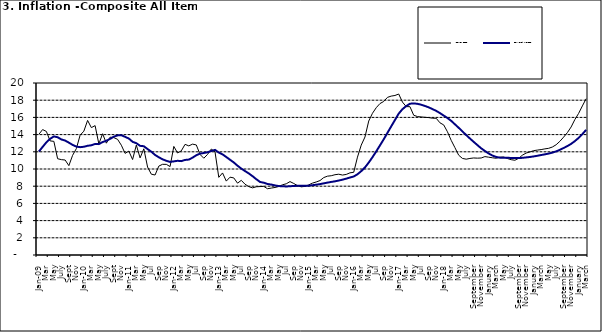
| Category | Year-on Rate | 12-Month Average |
|---|---|---|
| Jan-09 | 14.034 | 12.032 |
| Feb | 14.584 | 12.567 |
| Mar | 14.366 | 13.101 |
| Apr | 13.268 | 13.51 |
| May | 13.212 | 13.787 |
| June | 11.194 | 13.694 |
| July | 11.09 | 13.437 |
| Aug | 11.046 | 13.307 |
| Sept | 10.39 | 13.065 |
| Oct | 11.588 | 12.803 |
| Nov | 12.368 | 12.609 |
| Dec | 13.93 | 12.538 |
| Jan-10 | 14.398 | 12.586 |
| Feb | 15.649 | 12.7 |
| Mar | 14.812 | 12.757 |
| Apr | 15.044 | 12.915 |
| May | 12.915 | 12.893 |
| June | 14.099 | 13.132 |
| July | 13.002 | 13.284 |
| Aug | 13.702 | 13.5 |
| Sept | 13.65 | 13.764 |
| Oct | 13.45 | 13.908 |
| Nov | 12.766 | 13.928 |
| Dec | 11.815 | 13.74 |
| Jan-11 | 12.08 | 13.542 |
| Feb | 11.1 | 13.161 |
| Mar | 12.779 | 13.001 |
| Apr | 11.291 | 12.694 |
| May | 12.352 | 12.648 |
| Jun | 10.23 | 12.321 |
| Jul | 9.397 | 12.009 |
| Aug | 9.301 | 11.635 |
| Sep | 10.339 | 11.363 |
| Oct | 10.544 | 11.13 |
| Nov | 10.54 | 10.952 |
| Dec | 10.283 | 10.826 |
| Jan-12 | 12.626 | 10.886 |
| Feb | 11.866 | 10.955 |
| Mar | 12.111 | 10.914 |
| Apr | 12.866 | 11.054 |
| May | 12.688 | 11.096 |
| Jun | 12.892 | 11.32 |
| Jul | 12.797 | 11.599 |
| Aug | 11.689 | 11.791 |
| Sep | 11.253 | 11.859 |
| Oct | 11.693 | 11.948 |
| Nov | 12.32 | 12.091 |
| Dec | 11.981 | 12.224 |
| Jan-13 | 9.031 | 11.908 |
| Feb | 9.542 | 11.703 |
| Mar | 8.593 | 11.394 |
| Apr | 9.052 | 11.072 |
| May | 8.964 | 10.761 |
| Jun | 8.353 | 10.383 |
| Jul | 8.682 | 10.047 |
| Aug | 8.231 | 9.761 |
| Sep | 7.952 | 9.486 |
| Oct | 7.807 | 9.167 |
| Nov | 7.931 | 8.815 |
| Dec | 7.957 | 8.496 |
| Jan-14 | 7.977 | 8.408 |
| Feb | 7.707 | 8.257 |
| Mar | 7.783 | 8.19 |
| Apr | 7.851 | 8.092 |
| May | 7.965 | 8.012 |
| Jun | 8.167 | 7.998 |
| Jul | 8.281 | 7.968 |
| Aug | 8.534 | 7.996 |
| Sep | 8.317 | 8.027 |
| Oct | 8.06 | 8.047 |
| Nov | 7.927 | 8.046 |
| Dec | 7.978 | 8.047 |
| Jan-15 | 8.157 | 8.063 |
| Feb | 8.359 | 8.117 |
| Mar | 8.494 | 8.176 |
| Apr | 8.655 | 8.243 |
| May | 9.003 | 8.331 |
| Jun | 9.168 | 8.417 |
| Jul | 9.218 | 8.497 |
| Aug | 9.336 | 8.566 |
| Sep | 9.394 | 8.658 |
| Oct | 9.296 | 8.76 |
| Nov | 9.368 | 8.879 |
| Dec | 9.554 | 9.009 |
| Jan-16 | 9.617 | 9.13 |
| Feb | 11.379 | 9.386 |
| Mar | 12.775 | 9.751 |
| Apr | 13.721 | 10.182 |
| May | 15.577 | 10.746 |
| Jun | 16.48 | 11.372 |
| Jul | 17.127 | 12.045 |
| Aug | 17.609 | 12.744 |
| Sep | 17.852 | 13.454 |
| Oct | 18.33 | 14.206 |
| Nov | 18.476 | 14.958 |
| Dec | 18.547 | 15.697 |
| Jan-17 | 18.719 | 16.441 |
| Feb | 17.78 | 16.958 |
| Mar | 17.256 | 17.315 |
| Apr | 17.244 | 17.591 |
| May | 16.251 | 17.628 |
| Jun | 16.098 | 17.578 |
| Jul | 16.053 | 17.475 |
| Aug | 16.012 | 17.331 |
| Sep | 15.979 | 17.17 |
| Oct | 15.905 | 16.968 |
| Nov | 15.901 | 16.76 |
| Dec | 15.372 | 16.502 |
| Jan-18 | 15.127 | 16.215 |
| Feb | 14.33 | 15.93 |
| Mar | 13.337 | 15.599 |
| Apr | 12.482 | 15.196 |
| May | 11.608 | 14.793 |
| June | 11.231 | 14.371 |
| July | 11.142 | 13.95 |
| August | 11.227 | 13.546 |
| September | 11.284 | 13.157 |
| October | 11.259 | 12.777 |
| November | 11.281 | 12.406 |
| December | 11.442 | 12.095 |
| January | 11.374 | 11.801 |
| February | 11.306 | 11.564 |
| March | 11.251 | 11.401 |
| April | 11.372 | 11.314 |
| May | 11.396 | 11.299 |
| June | 11.217 | 11.297 |
| July | 11.084 | 11.291 |
| August | 11.016 | 11.271 |
| September | 11.244 | 11.268 |
| October | 11.607 | 11.298 |
| November | 11.854 | 11.348 |
| December | 11.982 | 11.396 |
| January | 12.132 | 11.462 |
| February | 12.199 | 11.539 |
| March | 12.257 | 11.624 |
| April | 12.341 | 11.706 |
| May | 12.404 | 11.791 |
| June | 12.559 | 11.904 |
| July | 12.821 | 12.049 |
| August | 13.22 | 12.233 |
| September | 13.707 | 12.44 |
| October | 14.233 | 12.664 |
| November | 14.887 | 12.923 |
| December | 15.753 | 13.246 |
| January | 16.466 | 13.616 |
| February | 17.335 | 14.053 |
| March | 18.171 | 14.554 |